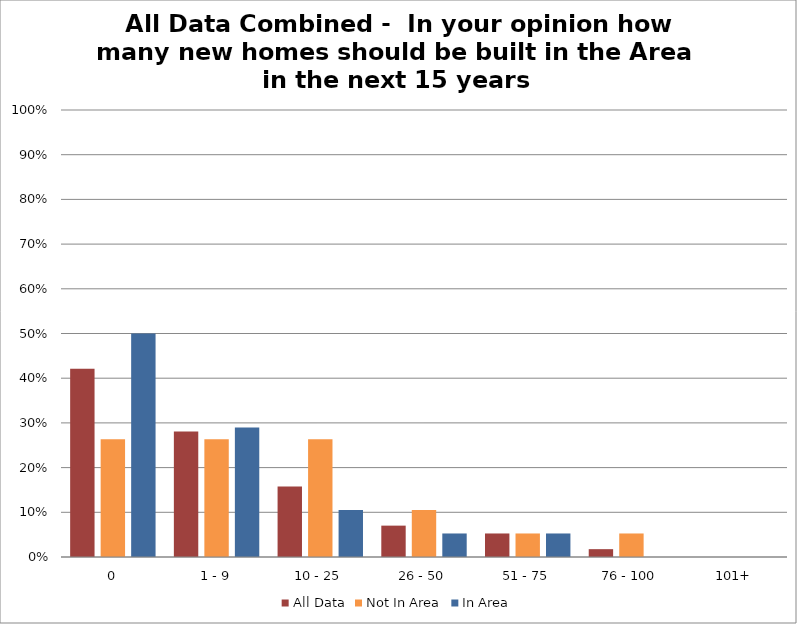
| Category | All Data | Not In Area | In Area |
|---|---|---|---|
| 0 | 0.421 | 0.263 | 0.5 |
| 1 - 9 | 0.281 | 0.263 | 0.289 |
| 10 - 25 | 0.158 | 0.263 | 0.105 |
| 26 - 50 | 0.07 | 0.105 | 0.053 |
| 51 - 75 | 0.053 | 0.053 | 0.053 |
| 76 - 100 | 0.018 | 0.053 | 0 |
| 101+ | 0 | 0 | 0 |